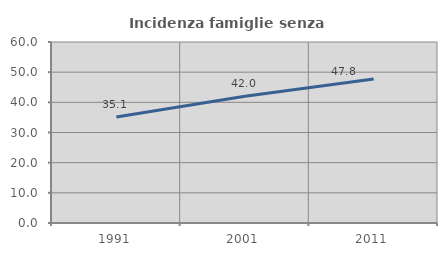
| Category | Incidenza famiglie senza nuclei |
|---|---|
| 1991.0 | 35.12 |
| 2001.0 | 42.039 |
| 2011.0 | 47.758 |